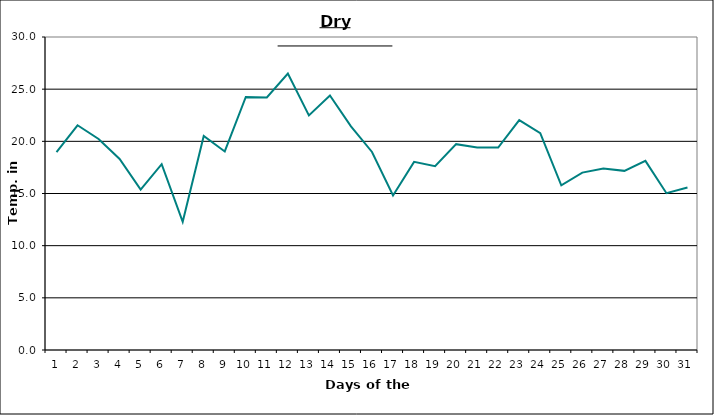
| Category | Series 0 |
|---|---|
| 0 | 18.97 |
| 1 | 21.54 |
| 2 | 20.23 |
| 3 | 18.31 |
| 4 | 15.38 |
| 5 | 17.81 |
| 6 | 12.29 |
| 7 | 20.51 |
| 8 | 19.03 |
| 9 | 24.25 |
| 10 | 24.2 |
| 11 | 26.49 |
| 12 | 22.48 |
| 13 | 24.4 |
| 14 | 21.44 |
| 15 | 18.98 |
| 16 | 14.81 |
| 17 | 18.03 |
| 18 | 17.61 |
| 19 | 19.73 |
| 20 | 19.41 |
| 21 | 19.4 |
| 22 | 22.04 |
| 23 | 20.79 |
| 24 | 15.78 |
| 25 | 17 |
| 26 | 17.4 |
| 27 | 17.17 |
| 28 | 18.13 |
| 29 | 15.03 |
| 30 | 15.58 |